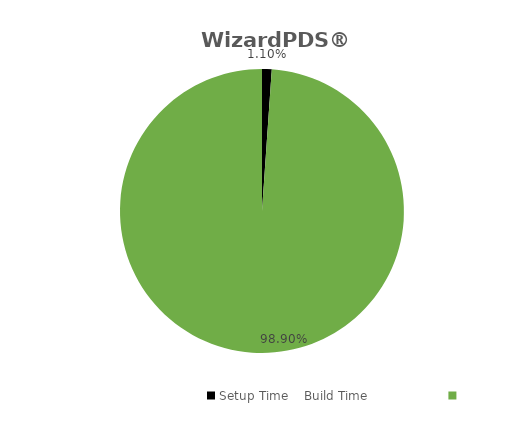
| Category | Series 0 |
|---|---|
| 0 | 0.011 |
| 1 | 0.989 |